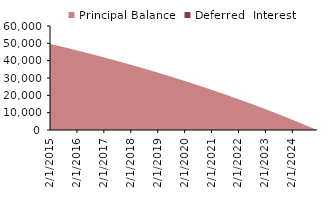
| Category | Principal Balance | Deferred  Interest |
|---|---|---|
| 2/1/15 | 49707.91 | 0 |
| 3/1/15 | 49381.45 | 0 |
| 4/1/15 | 49078.06 | 0 |
| 5/1/15 | 48765.01 | 0 |
| 6/1/15 | 48458.47 | 0 |
| 7/1/15 | 48142.35 | 0 |
| 8/1/15 | 47832.62 | 0 |
| 9/1/15 | 47521.26 | 0 |
| 10/1/15 | 47200.45 | 0 |
| 11/1/15 | 46885.85 | 0 |
| 12/1/15 | 46561.89 | 0 |
| 1/1/16 | 46244.02 | 0 |
| 2/1/16 | 45924.48 | 0 |
| 3/1/16 | 45588.16 | 0 |
| 4/1/16 | 45265.35 | 0 |
| 5/1/16 | 44933.41 | 0 |
| 6/1/16 | 44607.26 | 0 |
| 7/1/16 | 44272.05 | 0 |
| 8/1/16 | 43942.51 | 0 |
| 9/1/16 | 43611.24 | 0 |
| 10/1/16 | 43271.05 | 0 |
| 11/1/16 | 42936.33 | 0 |
| 12/1/16 | 42592.8 | 0 |
| 1/1/17 | 42254.62 | 0 |
| 2/1/17 | 41914.65 | 0 |
| 3/1/17 | 41552.23 | 0 |
| 4/1/17 | 41208.86 | 0 |
| 5/1/17 | 40856.91 | 0 |
| 6/1/17 | 40509.98 | 0 |
| 7/1/17 | 40154.57 | 0 |
| 8/1/17 | 39804.04 | 0 |
| 9/1/17 | 39451.68 | 0 |
| 10/1/17 | 39090.98 | 0 |
| 11/1/17 | 38734.96 | 0 |
| 12/1/17 | 38370.71 | 0 |
| 1/1/18 | 38011.01 | 0 |
| 2/1/18 | 37649.42 | 0 |
| 3/1/18 | 37267.37 | 0 |
| 4/1/18 | 36902.16 | 0 |
| 5/1/18 | 36528.97 | 0 |
| 6/1/18 | 36159.99 | 0 |
| 7/1/18 | 35783.12 | 0 |
| 8/1/18 | 35410.32 | 0 |
| 9/1/18 | 35035.57 | 0 |
| 10/1/18 | 34653.09 | 0 |
| 11/1/18 | 34274.46 | 0 |
| 12/1/18 | 33888.21 | 0 |
| 1/1/19 | 33505.67 | 0 |
| 2/1/19 | 33121.12 | 0 |
| 3/1/19 | 32718.23 | 0 |
| 4/1/19 | 32329.84 | 0 |
| 5/1/19 | 31934.1 | 0 |
| 6/1/19 | 31541.7 | 0 |
| 7/1/19 | 31142.06 | 0 |
| 8/1/19 | 30745.61 | 0 |
| 9/1/19 | 30347.09 | 0 |
| 10/1/19 | 29941.5 | 0 |
| 11/1/19 | 29538.86 | 0 |
| 12/1/19 | 29129.26 | 0 |
| 1/1/20 | 28722.47 | 0 |
| 2/1/20 | 28313.55 | 0 |
| 3/1/20 | 27893.18 | 0 |
| 4/1/20 | 27480.11 | 0 |
| 5/1/20 | 27060.37 | 0 |
| 6/1/20 | 26643.05 | 0 |
| 7/1/20 | 26219.16 | 0 |
| 8/1/20 | 25797.53 | 0 |
| 9/1/20 | 25373.7 | 0 |
| 10/1/20 | 24943.48 | 0 |
| 11/1/20 | 24515.28 | 0 |
| 12/1/20 | 24080.82 | 0 |
| 1/1/21 | 23648.21 | 0 |
| 2/1/21 | 23213.34 | 0 |
| 3/1/21 | 22764.75 | 0 |
| 4/1/21 | 22325.55 | 0 |
| 5/1/21 | 21880.39 | 0 |
| 6/1/21 | 21436.67 | 0 |
| 7/1/21 | 20987.11 | 0 |
| 8/1/21 | 20538.82 | 0 |
| 9/1/21 | 20088.19 | 0 |
| 10/1/21 | 19631.91 | 0 |
| 11/1/21 | 19176.64 | 0 |
| 12/1/21 | 18715.85 | 0 |
| 1/1/22 | 18255.89 | 0 |
| 2/1/22 | 17793.54 | 0 |
| 3/1/22 | 17320.01 | 0 |
| 4/1/22 | 16853.06 | 0 |
| 5/1/22 | 16380.91 | 0 |
| 6/1/22 | 15909.17 | 0 |
| 7/1/22 | 15432.35 | 0 |
| 8/1/22 | 14955.75 | 0 |
| 9/1/22 | 14476.67 | 0 |
| 10/1/22 | 13992.71 | 0 |
| 11/1/22 | 13508.71 | 0 |
| 12/1/22 | 13019.96 | 0 |
| 1/1/23 | 12530.98 | 0 |
| 2/1/23 | 12039.46 | 0 |
| 3/1/23 | 11539.43 | 0 |
| 4/1/23 | 11043.02 | 0 |
| 5/1/23 | 10542.22 | 0 |
| 6/1/23 | 10040.72 | 0 |
| 7/1/23 | 9534.96 | 0 |
| 8/1/23 | 9028.31 | 0 |
| 9/1/23 | 8519.03 | 0 |
| 10/1/23 | 8005.69 | 0 |
| 11/1/23 | 7491.18 | 0 |
| 12/1/23 | 6972.75 | 0 |
| 1/1/24 | 6452.95 | 0 |
| 2/1/24 | 5930.45 | 0 |
| 3/1/24 | 5403.28 | 0 |
| 4/1/24 | 4875.51 | 0 |
| 5/1/24 | 4344.19 | 0 |
| 6/1/24 | 3811.02 | 0 |
| 7/1/24 | 3274.44 | 0 |
| 8/1/24 | 2735.8 | 0 |
| 9/1/24 | 2194.35 | 0 |
| 10/1/24 | 1649.71 | 0 |
| 11/1/24 | 1102.71 | 0 |
| 12/1/24 | 552.66 | 0 |
| 1/1/25 | 0 | 0 |
| #N/A | 0 | 0 |
| #N/A | 0 | 0 |
| #N/A | 0 | 0 |
| #N/A | 0 | 0 |
| #N/A | 0 | 0 |
| #N/A | 0 | 0 |
| #N/A | 0 | 0 |
| #N/A | 0 | 0 |
| #N/A | 0 | 0 |
| #N/A | 0 | 0 |
| #N/A | 0 | 0 |
| #N/A | 0 | 0 |
| #N/A | 0 | 0 |
| #N/A | 0 | 0 |
| #N/A | 0 | 0 |
| #N/A | 0 | 0 |
| #N/A | 0 | 0 |
| #N/A | 0 | 0 |
| #N/A | 0 | 0 |
| #N/A | 0 | 0 |
| #N/A | 0 | 0 |
| #N/A | 0 | 0 |
| #N/A | 0 | 0 |
| #N/A | 0 | 0 |
| #N/A | 0 | 0 |
| #N/A | 0 | 0 |
| #N/A | 0 | 0 |
| #N/A | 0 | 0 |
| #N/A | 0 | 0 |
| #N/A | 0 | 0 |
| #N/A | 0 | 0 |
| #N/A | 0 | 0 |
| #N/A | 0 | 0 |
| #N/A | 0 | 0 |
| #N/A | 0 | 0 |
| #N/A | 0 | 0 |
| #N/A | 0 | 0 |
| #N/A | 0 | 0 |
| #N/A | 0 | 0 |
| #N/A | 0 | 0 |
| #N/A | 0 | 0 |
| #N/A | 0 | 0 |
| #N/A | 0 | 0 |
| #N/A | 0 | 0 |
| #N/A | 0 | 0 |
| #N/A | 0 | 0 |
| #N/A | 0 | 0 |
| #N/A | 0 | 0 |
| #N/A | 0 | 0 |
| #N/A | 0 | 0 |
| #N/A | 0 | 0 |
| #N/A | 0 | 0 |
| #N/A | 0 | 0 |
| #N/A | 0 | 0 |
| #N/A | 0 | 0 |
| #N/A | 0 | 0 |
| #N/A | 0 | 0 |
| #N/A | 0 | 0 |
| #N/A | 0 | 0 |
| #N/A | 0 | 0 |
| #N/A | 0 | 0 |
| #N/A | 0 | 0 |
| #N/A | 0 | 0 |
| #N/A | 0 | 0 |
| #N/A | 0 | 0 |
| #N/A | 0 | 0 |
| #N/A | 0 | 0 |
| #N/A | 0 | 0 |
| #N/A | 0 | 0 |
| #N/A | 0 | 0 |
| #N/A | 0 | 0 |
| #N/A | 0 | 0 |
| #N/A | 0 | 0 |
| #N/A | 0 | 0 |
| #N/A | 0 | 0 |
| #N/A | 0 | 0 |
| #N/A | 0 | 0 |
| #N/A | 0 | 0 |
| #N/A | 0 | 0 |
| #N/A | 0 | 0 |
| #N/A | 0 | 0 |
| #N/A | 0 | 0 |
| #N/A | 0 | 0 |
| #N/A | 0 | 0 |
| #N/A | 0 | 0 |
| #N/A | 0 | 0 |
| #N/A | 0 | 0 |
| #N/A | 0 | 0 |
| #N/A | 0 | 0 |
| #N/A | 0 | 0 |
| #N/A | 0 | 0 |
| #N/A | 0 | 0 |
| #N/A | 0 | 0 |
| #N/A | 0 | 0 |
| #N/A | 0 | 0 |
| #N/A | 0 | 0 |
| #N/A | 0 | 0 |
| #N/A | 0 | 0 |
| #N/A | 0 | 0 |
| #N/A | 0 | 0 |
| #N/A | 0 | 0 |
| #N/A | 0 | 0 |
| #N/A | 0 | 0 |
| #N/A | 0 | 0 |
| #N/A | 0 | 0 |
| #N/A | 0 | 0 |
| #N/A | 0 | 0 |
| #N/A | 0 | 0 |
| #N/A | 0 | 0 |
| #N/A | 0 | 0 |
| #N/A | 0 | 0 |
| #N/A | 0 | 0 |
| #N/A | 0 | 0 |
| #N/A | 0 | 0 |
| #N/A | 0 | 0 |
| #N/A | 0 | 0 |
| #N/A | 0 | 0 |
| #N/A | 0 | 0 |
| #N/A | 0 | 0 |
| #N/A | 0 | 0 |
| #N/A | 0 | 0 |
| #N/A | 0 | 0 |
| #N/A | 0 | 0 |
| #N/A | 0 | 0 |
| #N/A | 0 | 0 |
| #N/A | 0 | 0 |
| #N/A | 0 | 0 |
| #N/A | 0 | 0 |
| #N/A | 0 | 0 |
| #N/A | 0 | 0 |
| #N/A | 0 | 0 |
| #N/A | 0 | 0 |
| #N/A | 0 | 0 |
| #N/A | 0 | 0 |
| #N/A | 0 | 0 |
| #N/A | 0 | 0 |
| #N/A | 0 | 0 |
| #N/A | 0 | 0 |
| #N/A | 0 | 0 |
| #N/A | 0 | 0 |
| #N/A | 0 | 0 |
| #N/A | 0 | 0 |
| #N/A | 0 | 0 |
| #N/A | 0 | 0 |
| #N/A | 0 | 0 |
| #N/A | 0 | 0 |
| #N/A | 0 | 0 |
| #N/A | 0 | 0 |
| #N/A | 0 | 0 |
| #N/A | 0 | 0 |
| #N/A | 0 | 0 |
| #N/A | 0 | 0 |
| #N/A | 0 | 0 |
| #N/A | 0 | 0 |
| #N/A | 0 | 0 |
| #N/A | 0 | 0 |
| #N/A | 0 | 0 |
| #N/A | 0 | 0 |
| #N/A | 0 | 0 |
| #N/A | 0 | 0 |
| #N/A | 0 | 0 |
| #N/A | 0 | 0 |
| #N/A | 0 | 0 |
| #N/A | 0 | 0 |
| #N/A | 0 | 0 |
| #N/A | 0 | 0 |
| #N/A | 0 | 0 |
| #N/A | 0 | 0 |
| #N/A | 0 | 0 |
| #N/A | 0 | 0 |
| #N/A | 0 | 0 |
| #N/A | 0 | 0 |
| #N/A | 0 | 0 |
| #N/A | 0 | 0 |
| #N/A | 0 | 0 |
| #N/A | 0 | 0 |
| #N/A | 0 | 0 |
| #N/A | 0 | 0 |
| #N/A | 0 | 0 |
| #N/A | 0 | 0 |
| #N/A | 0 | 0 |
| #N/A | 0 | 0 |
| #N/A | 0 | 0 |
| #N/A | 0 | 0 |
| #N/A | 0 | 0 |
| #N/A | 0 | 0 |
| #N/A | 0 | 0 |
| #N/A | 0 | 0 |
| #N/A | 0 | 0 |
| #N/A | 0 | 0 |
| #N/A | 0 | 0 |
| #N/A | 0 | 0 |
| #N/A | 0 | 0 |
| #N/A | 0 | 0 |
| #N/A | 0 | 0 |
| #N/A | 0 | 0 |
| #N/A | 0 | 0 |
| #N/A | 0 | 0 |
| #N/A | 0 | 0 |
| #N/A | 0 | 0 |
| #N/A | 0 | 0 |
| #N/A | 0 | 0 |
| #N/A | 0 | 0 |
| #N/A | 0 | 0 |
| #N/A | 0 | 0 |
| #N/A | 0 | 0 |
| #N/A | 0 | 0 |
| #N/A | 0 | 0 |
| #N/A | 0 | 0 |
| #N/A | 0 | 0 |
| #N/A | 0 | 0 |
| #N/A | 0 | 0 |
| #N/A | 0 | 0 |
| #N/A | 0 | 0 |
| #N/A | 0 | 0 |
| #N/A | 0 | 0 |
| #N/A | 0 | 0 |
| #N/A | 0 | 0 |
| #N/A | 0 | 0 |
| #N/A | 0 | 0 |
| #N/A | 0 | 0 |
| #N/A | 0 | 0 |
| #N/A | 0 | 0 |
| #N/A | 0 | 0 |
| #N/A | 0 | 0 |
| #N/A | 0 | 0 |
| #N/A | 0 | 0 |
| #N/A | 0 | 0 |
| #N/A | 0 | 0 |
| #N/A | 0 | 0 |
| #N/A | 0 | 0 |
| #N/A | 0 | 0 |
| #N/A | 0 | 0 |
| #N/A | 0 | 0 |
| #N/A | 0 | 0 |
| #N/A | 0 | 0 |
| #N/A | 0 | 0 |
| #N/A | 0 | 0 |
| #N/A | 0 | 0 |
| #N/A | 0 | 0 |
| #N/A | 0 | 0 |
| #N/A | 0 | 0 |
| #N/A | 0 | 0 |
| #N/A | 0 | 0 |
| #N/A | 0 | 0 |
| #N/A | 0 | 0 |
| #N/A | 0 | 0 |
| #N/A | 0 | 0 |
| #N/A | 0 | 0 |
| #N/A | 0 | 0 |
| #N/A | 0 | 0 |
| #N/A | 0 | 0 |
| #N/A | 0 | 0 |
| #N/A | 0 | 0 |
| #N/A | 0 | 0 |
| #N/A | 0 | 0 |
| #N/A | 0 | 0 |
| #N/A | 0 | 0 |
| #N/A | 0 | 0 |
| #N/A | 0 | 0 |
| #N/A | 0 | 0 |
| #N/A | 0 | 0 |
| #N/A | 0 | 0 |
| #N/A | 0 | 0 |
| #N/A | 0 | 0 |
| #N/A | 0 | 0 |
| #N/A | 0 | 0 |
| #N/A | 0 | 0 |
| #N/A | 0 | 0 |
| #N/A | 0 | 0 |
| #N/A | 0 | 0 |
| #N/A | 0 | 0 |
| #N/A | 0 | 0 |
| #N/A | 0 | 0 |
| #N/A | 0 | 0 |
| #N/A | 0 | 0 |
| #N/A | 0 | 0 |
| #N/A | 0 | 0 |
| #N/A | 0 | 0 |
| #N/A | 0 | 0 |
| #N/A | 0 | 0 |
| #N/A | 0 | 0 |
| #N/A | 0 | 0 |
| #N/A | 0 | 0 |
| #N/A | 0 | 0 |
| #N/A | 0 | 0 |
| #N/A | 0 | 0 |
| #N/A | 0 | 0 |
| #N/A | 0 | 0 |
| #N/A | 0 | 0 |
| #N/A | 0 | 0 |
| #N/A | 0 | 0 |
| #N/A | 0 | 0 |
| #N/A | 0 | 0 |
| #N/A | 0 | 0 |
| #N/A | 0 | 0 |
| #N/A | 0 | 0 |
| #N/A | 0 | 0 |
| #N/A | 0 | 0 |
| #N/A | 0 | 0 |
| #N/A | 0 | 0 |
| #N/A | 0 | 0 |
| #N/A | 0 | 0 |
| #N/A | 0 | 0 |
| #N/A | 0 | 0 |
| #N/A | 0 | 0 |
| #N/A | 0 | 0 |
| #N/A | 0 | 0 |
| #N/A | 0 | 0 |
| #N/A | 0 | 0 |
| #N/A | 0 | 0 |
| #N/A | 0 | 0 |
| #N/A | 0 | 0 |
| #N/A | 0 | 0 |
| #N/A | 0 | 0 |
| #N/A | 0 | 0 |
| #N/A | 0 | 0 |
| #N/A | 0 | 0 |
| #N/A | 0 | 0 |
| #N/A | 0 | 0 |
| #N/A | 0 | 0 |
| #N/A | 0 | 0 |
| #N/A | 0 | 0 |
| #N/A | 0 | 0 |
| #N/A | 0 | 0 |
| #N/A | 0 | 0 |
| #N/A | 0 | 0 |
| #N/A | 0 | 0 |
| #N/A | 0 | 0 |
| #N/A | 0 | 0 |
| #N/A | 0 | 0 |
| #N/A | 0 | 0 |
| #N/A | 0 | 0 |
| #N/A | 0 | 0 |
| #N/A | 0 | 0 |
| #N/A | 0 | 0 |
| #N/A | 0 | 0 |
| #N/A | 0 | 0 |
| #N/A | 0 | 0 |
| #N/A | 0 | 0 |
| #N/A | 0 | 0 |
| #N/A | 0 | 0 |
| #N/A | 0 | 0 |
| #N/A | 0 | 0 |
| #N/A | 0 | 0 |
| #N/A | 0 | 0 |
| #N/A | 0 | 0 |
| #N/A | 0 | 0 |
| #N/A | 0 | 0 |
| #N/A | 0 | 0 |
| #N/A | 0 | 0 |
| #N/A | 0 | 0 |
| #N/A | 0 | 0 |
| #N/A | 0 | 0 |
| #N/A | 0 | 0 |
| #N/A | 0 | 0 |
| #N/A | 0 | 0 |
| #N/A | 0 | 0 |
| #N/A | 0 | 0 |
| #N/A | 0 | 0 |